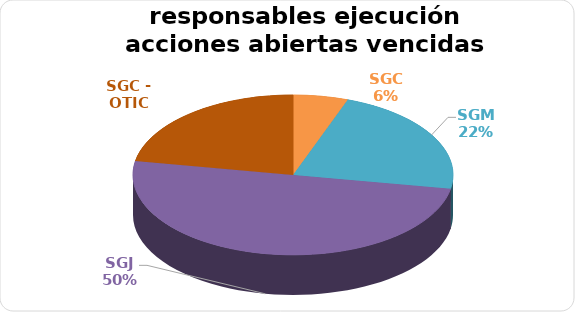
| Category | Series 0 |
|---|---|
| SGC | 1 |
| SGM | 4 |
| SGJ | 9 |
| SGC - OTIC | 4 |